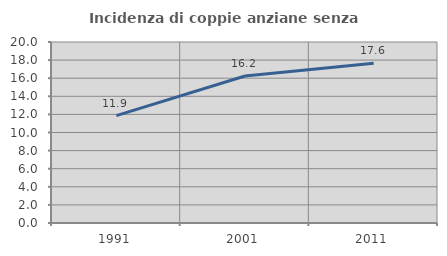
| Category | Incidenza di coppie anziane senza figli  |
|---|---|
| 1991.0 | 11.864 |
| 2001.0 | 16.239 |
| 2011.0 | 17.647 |